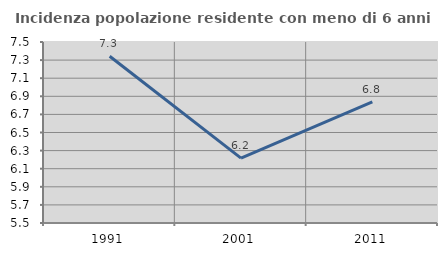
| Category | Incidenza popolazione residente con meno di 6 anni |
|---|---|
| 1991.0 | 7.342 |
| 2001.0 | 6.216 |
| 2011.0 | 6.838 |